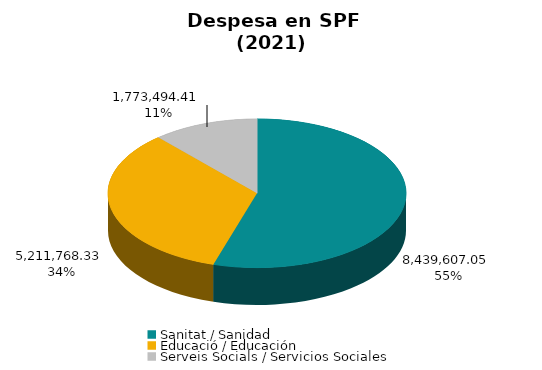
| Category | Series 0 |
|---|---|
| Sanitat / Sanidad | 8439607.05 |
| Educació / Educación | 5211768.33 |
| Serveis Socials / Servicios Sociales | 1773494.41 |